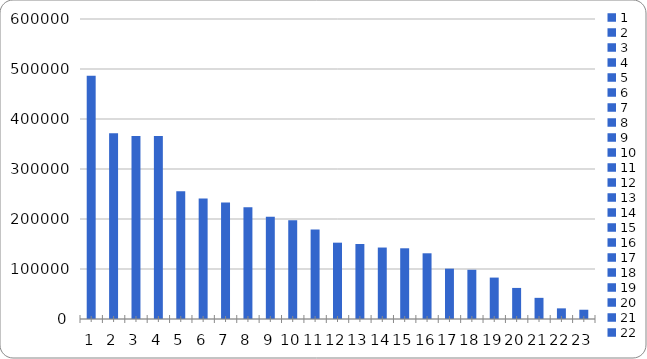
| Category | Series 0 |
|---|---|
| 0 | 486388 |
| 1 | 371739 |
| 2 | 365847 |
| 3 | 365758 |
| 4 | 255488 |
| 5 | 241213 |
| 6 | 232843 |
| 7 | 223683 |
| 8 | 204614 |
| 9 | 197570 |
| 10 | 178875 |
| 11 | 152662 |
| 12 | 150013 |
| 13 | 142933 |
| 14 | 141426 |
| 15 | 131426 |
| 16 | 100710 |
| 17 | 98455 |
| 18 | 82836 |
| 19 | 62143 |
| 20 | 42314 |
| 21 | 21286 |
| 22 | 18521 |